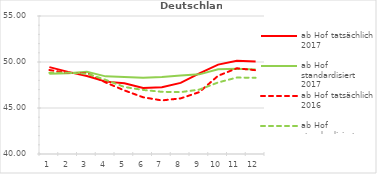
| Category | ab Hof tatsächlich 2017 | ab Hof standardisiert 2017 | ab Hof tatsächlich 2016 | ab Hof standardisiert 2016 |
|---|---|---|---|---|
| 0 | 49.441 | 48.719 | 49.129 | 48.82 |
| 1 | 48.925 | 48.783 | 48.8 | 48.832 |
| 2 | 48.475 | 48.926 | 48.802 | 48.737 |
| 3 | 47.867 | 48.438 | 47.779 | 48.062 |
| 4 | 47.694 | 48.376 | 46.913 | 47.288 |
| 5 | 47.165 | 48.282 | 46.166 | 46.963 |
| 6 | 47.256 | 48.371 | 45.824 | 46.758 |
| 7 | 47.725 | 48.535 | 46.044 | 46.727 |
| 8 | 48.758 | 48.657 | 46.731 | 47.001 |
| 9 | 49.717 | 49.215 | 48.506 | 47.777 |
| 10 | 50.136 | 49.279 | 49.317 | 48.311 |
| 11 | 50.045 | 49.182 | 49.106 | 48.286 |